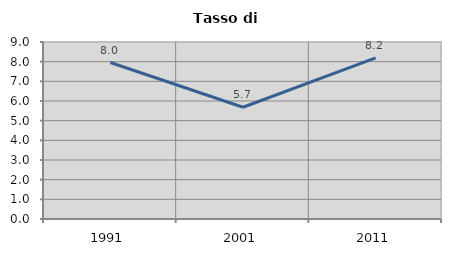
| Category | Tasso di disoccupazione   |
|---|---|
| 1991.0 | 7.956 |
| 2001.0 | 5.682 |
| 2011.0 | 8.196 |